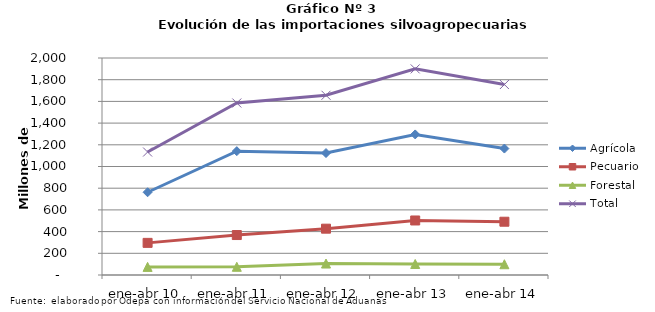
| Category | Agrícola | Pecuario | Forestal | Total |
|---|---|---|---|---|
| ene-abr 10 | 762570 | 296098 | 74803 | 1133471 |
| ene-abr 11 | 1141461 | 368256 | 75606 | 1585323 |
| ene-abr 12 | 1123885 | 426973 | 105568 | 1656426 |
| ene-abr 13 | 1295521 | 502519 | 101564 | 1899604 |
| ene-abr 14 | 1165328 | 491063 | 99128 | 1755519 |